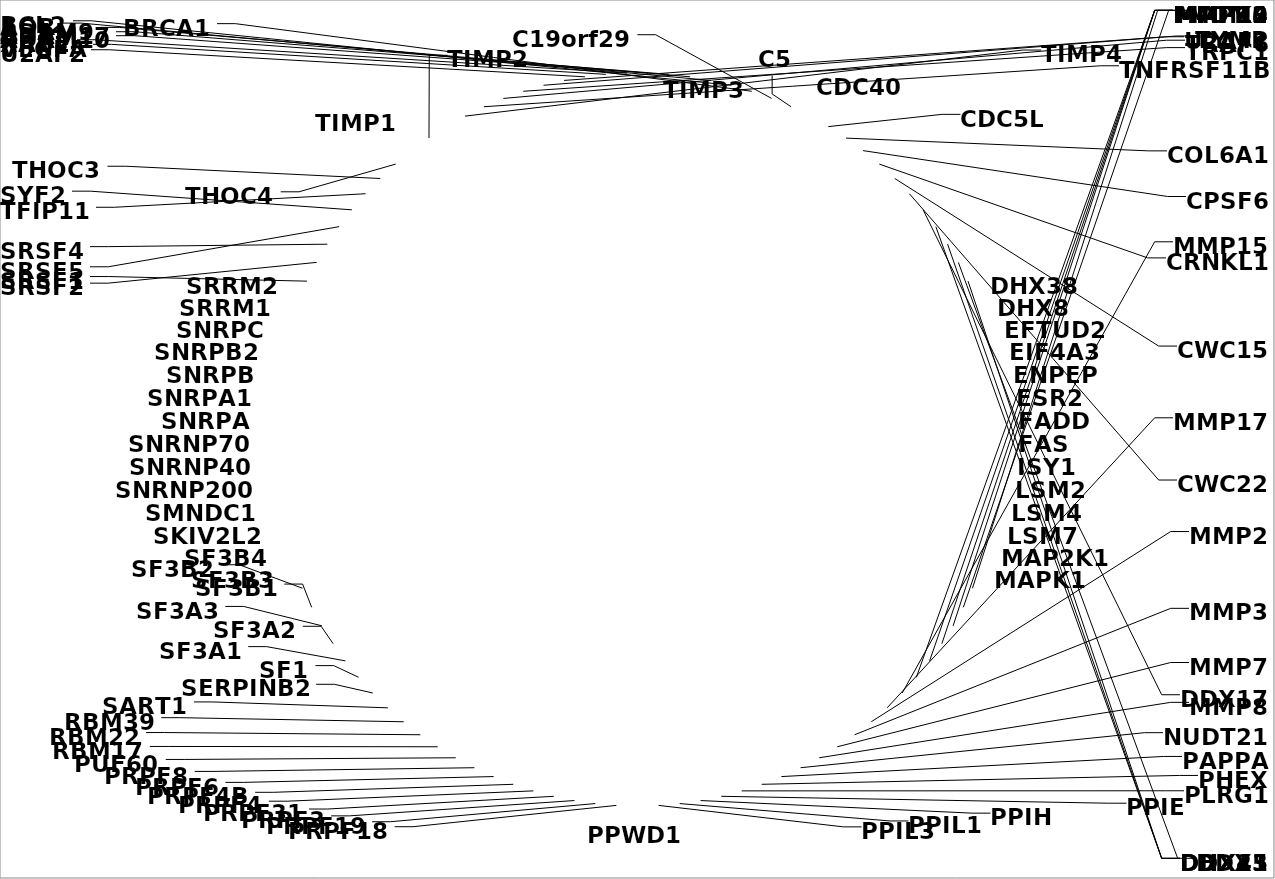
| Category | Series 0 |
|---|---|
| ADAM10 | 1 |
| ADAM17 | 1 |
| ADAM9 | 1 |
| AQR | 1 |
| BCL2 | 1 |
| BRCA1 | 1 |
| C19orf29 | 1 |
| C5 | 1 |
| CDC40 | 1 |
| CDC5L | 1 |
| COL6A1 | 1 |
| CPSF6 | 1 |
| CRNKL1 | 1 |
| CWC15 | 1 |
| CWC22 | 1 |
| DDX17 | 1 |
| DDX23 | 1 |
| DDX41 | 1 |
| DDX5 | 1 |
| DHX15 | 1 |
| DHX38 | 1 |
| DHX8 | 1 |
| EFTUD2 | 1 |
| EIF4A3 | 1 |
| ENPEP | 1 |
| ESR2 | 1 |
| FADD | 1 |
| FAS | 1 |
| ISY1 | 1 |
| LSM2 | 1 |
| LSM4 | 1 |
| LSM7 | 1 |
| MAP2K1 | 1 |
| MAPK1 | 1 |
| MAPK3 | 1 |
| MDM2 | 1 |
| MMP10 | 1 |
| MMP12 | 1 |
| MMP13 | 1 |
| MMP14 | 1 |
| MMP15 | 1 |
| MMP17 | 1 |
| MMP2 | 1 |
| MMP3 | 1 |
| MMP7 | 1 |
| MMP8 | 1 |
| NUDT21 | 1 |
| PAPPA | 1 |
| PHEX | 1 |
| PLRG1 | 1 |
| PPIE | 1 |
| PPIH | 1 |
| PPIL1 | 1 |
| PPIL3 | 1 |
| PPWD1 | 1 |
| PRPF18 | 1 |
| PRPF19 | 1 |
| PRPF3 | 1 |
| PRPF31 | 1 |
| PRPF4 | 1 |
| PRPF4B | 1 |
| PRPF6 | 1 |
| PRPF8 | 1 |
| PUF60 | 1 |
| RBM17 | 1 |
| RBM22 | 1 |
| RBM39 | 1 |
| SART1 | 1 |
| SERPINB2 | 1 |
| SF1 | 1 |
| SF3A1 | 1 |
| SF3A2 | 1 |
| SF3A3 | 1 |
| SF3B1 | 1 |
| SF3B2 | 1 |
| SF3B3 | 1 |
| SF3B4 | 1 |
| SKIV2L2 | 1 |
| SMNDC1 | 1 |
| SNRNP200 | 1 |
| SNRNP40 | 1 |
| SNRNP70 | 1 |
| SNRPA | 1 |
| SNRPA1 | 1 |
| SNRPB | 1 |
| SNRPB2 | 1 |
| SNRPC | 1 |
| SRRM1 | 1 |
| SRRM2 | 1 |
| SRSF1 | 1 |
| SRSF2 | 1 |
| SRSF4 | 1 |
| SRSF5 | 1 |
| SYF2 | 1 |
| TFIP11 | 1 |
| THOC3 | 1 |
| THOC4 | 1 |
| TIMP1 | 1 |
| TIMP2 | 1 |
| TIMP3 | 1 |
| TIMP4 | 1 |
| TNFRSF11B | 1 |
| TRAF6 | 1 |
| TRPC1 | 1 |
| TYMP | 1 |
| U2AF1 | 1 |
| U2AF2 | 1 |
| VEGFA | 1 |
| XAB2 | 1 |